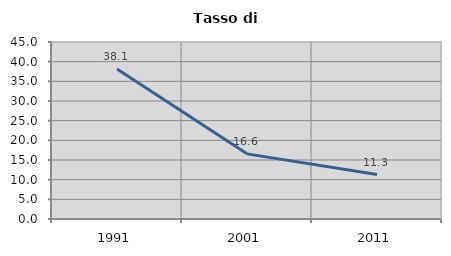
| Category | Tasso di disoccupazione   |
|---|---|
| 1991.0 | 38.139 |
| 2001.0 | 16.559 |
| 2011.0 | 11.291 |